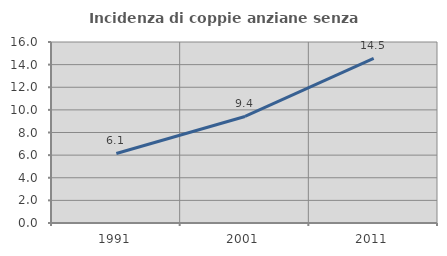
| Category | Incidenza di coppie anziane senza figli  |
|---|---|
| 1991.0 | 6.148 |
| 2001.0 | 9.415 |
| 2011.0 | 14.549 |